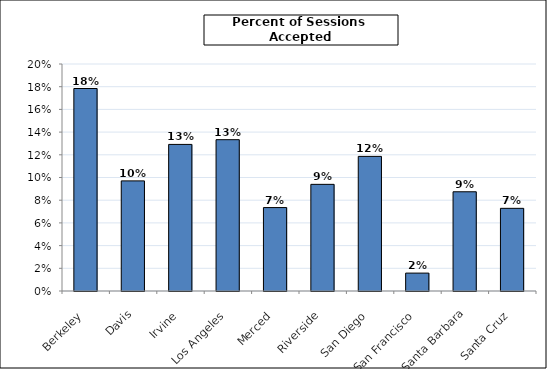
| Category | Sessions Accepted (by responding library) |
|---|---|
| Berkeley | 0.178 |
| Davis | 0.097 |
| Irvine | 0.129 |
| Los Angeles | 0.133 |
| Merced | 0.074 |
| Riverside | 0.094 |
| San Diego | 0.119 |
| San Francisco | 0.016 |
| Santa Barbara | 0.087 |
| Santa Cruz | 0.073 |